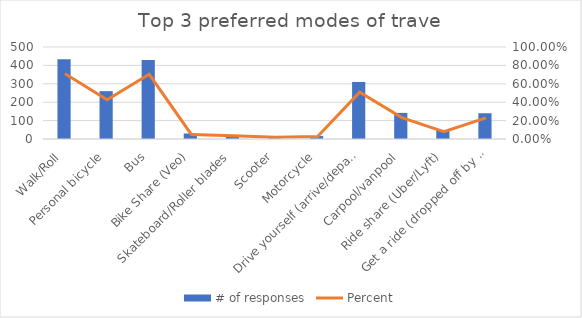
| Category | # of responses |
|---|---|
| Walk/Roll | 433 |
| Personal bicycle | 260 |
| Bus | 429 |
| Bike Share (Veo) | 30 |
| Skateboard/Roller blades | 22 |
| Scooter | 11 |
| Motorcycle | 16 |
| Drive yourself (arrive/depart alone) | 310 |
| Carpool/vanpool | 142 |
| Ride share (Uber/Lyft) | 48 |
| Get a ride (dropped off by someone who goes elsewhere... not in campus | 140 |